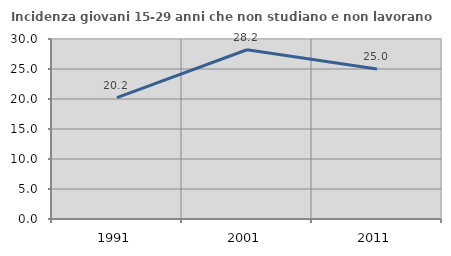
| Category | Incidenza giovani 15-29 anni che non studiano e non lavorano  |
|---|---|
| 1991.0 | 20.22 |
| 2001.0 | 28.205 |
| 2011.0 | 25 |